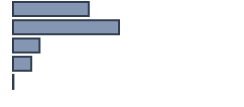
| Category | Series 0 |
|---|---|
| 0 | 33.366 |
| 1 | 46.706 |
| 2 | 11.672 |
| 3 | 8.067 |
| 4 | 0.19 |